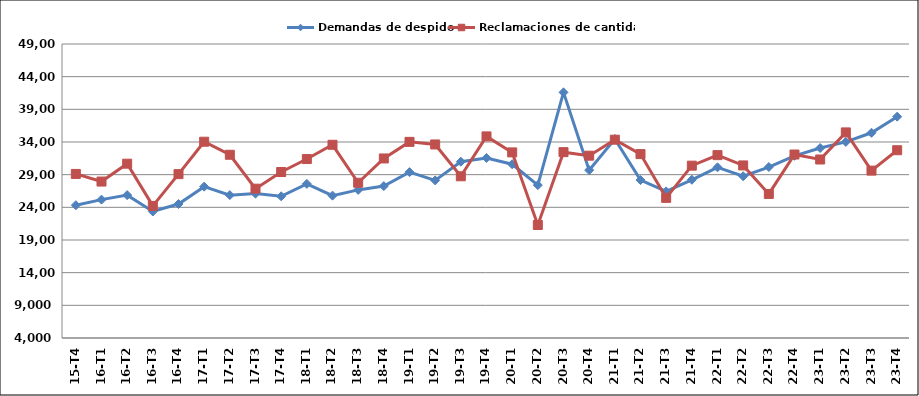
| Category | Demandas de despido | Reclamaciones de cantidad |
|---|---|---|
| 15-T4 | 24328 | 29112 |
| 16-T1 | 25182 | 27945 |
| 16-T2 | 25866 | 30682 |
| 16-T3 | 23364 | 24220 |
| 16-T4 | 24509 | 29081 |
| 17-T1 | 27166 | 34041 |
| 17-T2 | 25869 | 32047 |
| 17-T3 | 26101 | 26854 |
| 17-T4 | 25688 | 29408 |
| 18-T1 | 27589 | 31392 |
| 18-T2 | 25785 | 33573 |
| 18-T3 | 26669 | 27761 |
| 18-T4 | 27251 | 31480 |
| 19-T1 | 29386 | 34020 |
| 19-T2 | 28121 | 33623 |
| 19-T3 | 30981 | 28752 |
| 19-T4 | 31561 | 34857 |
| 20-T1 | 30597 | 32408 |
| 20-T2 | 27401 | 21297 |
| 20-T3 | 41597 | 32446 |
| 20-T4 | 29692 | 31906 |
| 21-T1 | 34461 | 34356 |
| 21-T2 | 28179 | 32151 |
| 21-T3 | 26434 | 25447 |
| 21-T4 | 28219 | 30377 |
| 22-T1 | 30126 | 31990 |
| 22-T2 | 28753 | 30414 |
| 22-T3 | 30167 | 26050 |
| 22-T4 | 31889 | 32084 |
| 23-T1 | 33079 | 31323 |
| 23-T2 | 34014 | 35469 |
| 23-T3 | 35413 | 29621 |
| 23-T4 | 37878 | 32742 |